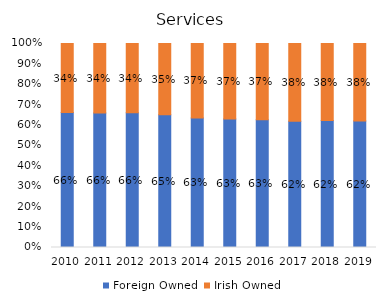
| Category | Foreign Owned | Irish Owned |
|---|---|---|
| 2010.0 | 0.662 | 0.338 |
| 2011.0 | 0.659 | 0.341 |
| 2012.0 | 0.661 | 0.339 |
| 2013.0 | 0.651 | 0.349 |
| 2014.0 | 0.635 | 0.365 |
| 2015.0 | 0.63 | 0.37 |
| 2016.0 | 0.626 | 0.374 |
| 2017.0 | 0.619 | 0.381 |
| 2018.0 | 0.622 | 0.378 |
| 2019.0 | 0.62 | 0.38 |